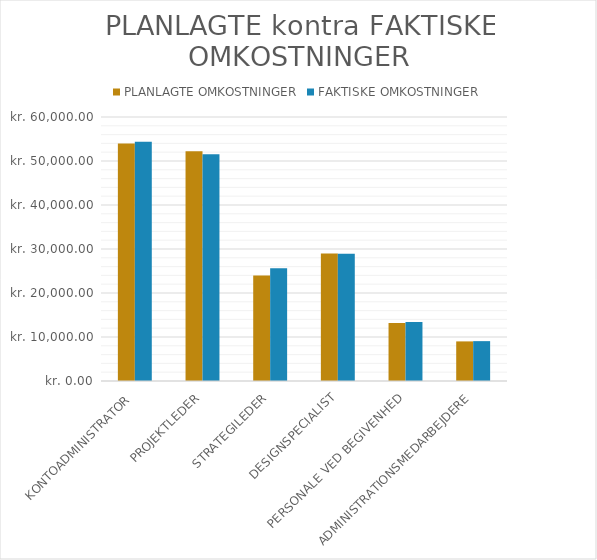
| Category | PLANLAGTE OMKOSTNINGER | FAKTISKE OMKOSTNINGER |
|---|---|---|
| KONTOADMINISTRATOR | 54000 | 54360 |
| PROJEKTLEDER | 52200 | 51540 |
| STRATEGILEDER | 24000 | 25650 |
| DESIGNSPECIALIST | 29000 | 28900 |
| PERSONALE VED BEGIVENHED | 13200 | 13400 |
| ADMINISTRATIONSMEDARBEJDERE | 9000 | 9060 |